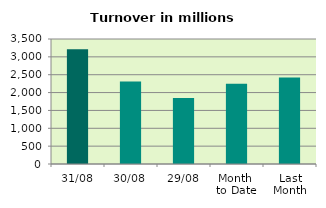
| Category | Series 0 |
|---|---|
| 31/08 | 3212.508 |
| 30/08 | 2306.864 |
| 29/08 | 1849.671 |
| Month 
to Date | 2249.305 |
| Last
Month | 2421.628 |